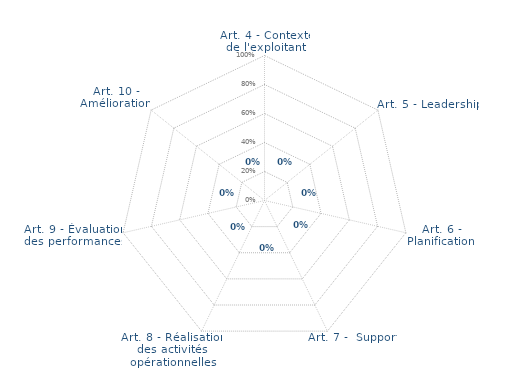
| Category | Sélectionnez | Eval Détaillée |
|---|---|---|
| Art. 4 - Contexte de l'exploitant | 0 | 0 |
| Art. 5 - Leadership | 0 | 0 |
| Art. 6 - Planification | 0 | 0 |
| Art. 7 -  Support | 0 | 0 |
| Art. 8 - Réalisation des activités opérationnelles | 0 | 0 |
| Art. 9 - Évaluation des performances | 0 | 0 |
| Art. 10 - Amélioration | 0 | 0 |